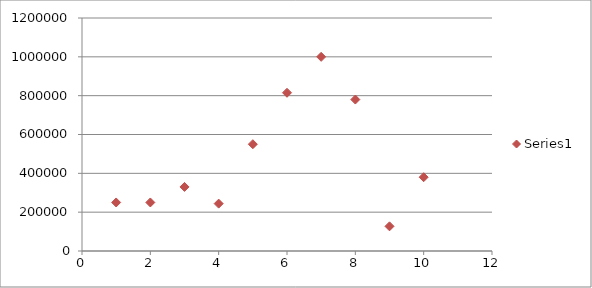
| Category | Series 0 |
|---|---|
| 0 | 250000 |
| 1 | 250000 |
| 2 | 330000 |
| 3 | 244000 |
| 4 | 550000 |
| 5 | 815000 |
| 6 | 1000000 |
| 7 | 780000 |
| 8 | 127000 |
| 9 | 380000 |